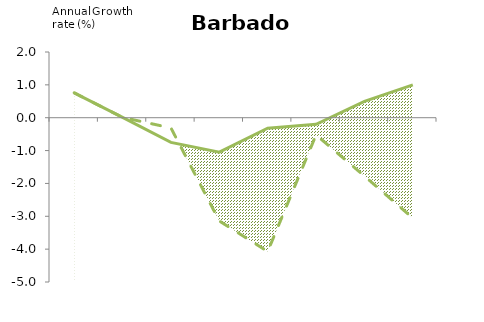
| Category | Series 1 | Series 4 |
|---|---|---|
| 0 | 0.758 | 0.758 |
| 1 | 0.009 | 0.009 |
| 2 | -0.75 | -0.311 |
| 3 | -1.05 | -3.143 |
| 4 | -0.32 | -4.072 |
| 5 | -0.2 | -0.523 |
| 6 | 0.5 | -1.776 |
| 7 | 1 | -3.055 |